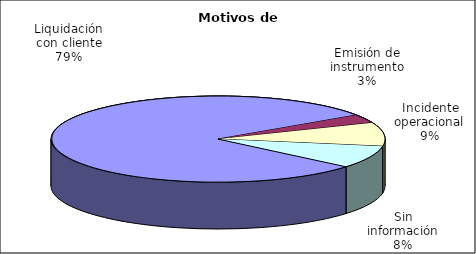
| Category | Motivos |
|---|---|
| Liquidación con cliente | 197 |
| Emisión de instrumento | 8 |
| Incidente operacional | 22 |
| Sin información | 21 |